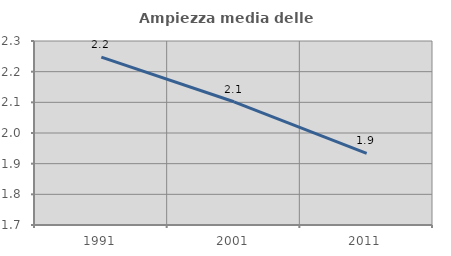
| Category | Ampiezza media delle famiglie |
|---|---|
| 1991.0 | 2.247 |
| 2001.0 | 2.102 |
| 2011.0 | 1.933 |